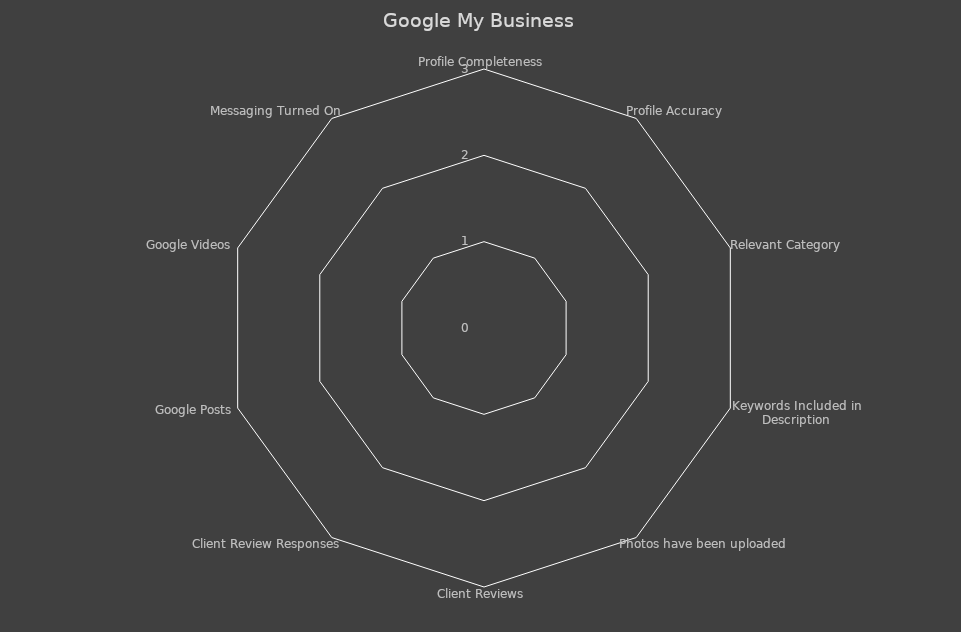
| Category | Series 0 |
|---|---|
| Profile Completeness | 0 |
| Profile Accuracy | 0 |
| Relevant Category | 0 |
| Keywords Included in Description | 0 |
| Photos have been uploaded | 0 |
| Client Reviews | 0 |
| Client Review Responses | 0 |
| Google Posts | 0 |
| Google Videos | 0 |
| Messaging Turned On | 0 |